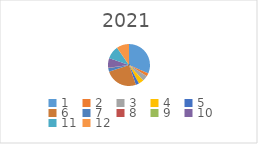
| Category | Series 0 |
|---|---|
| 1.0 | 695633.65 |
| 2.0 | 52758.43 |
| 3.0 | 92603 |
| 4.0 | 88040.58 |
| 5.0 | 55248.89 |
| 6.0 | 553579.36 |
| 7.0 | 62081.23 |
| 8.0 | 5104.73 |
| 9.0 | 1156.31 |
| 10.0 | 162947.06 |
| 11.0 | 221029.12 |
| 12.0 | 212553.78 |